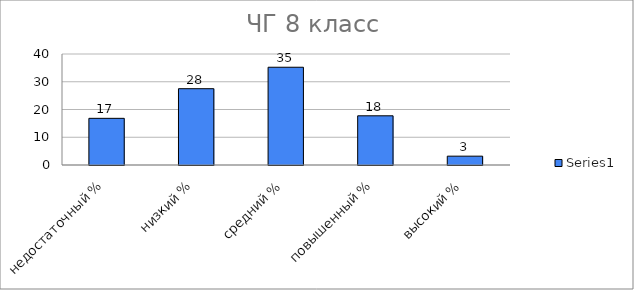
| Category | Series 0 |
|---|---|
| недостаточный % | 16.818 |
| низкий % | 27.5 |
| средний % | 35.227 |
| повышенный % | 17.727 |
| высокий % | 3.182 |